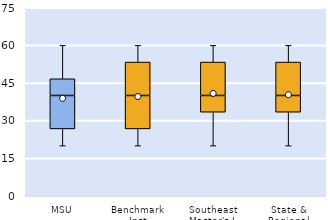
| Category | 25th | 50th | 75th |
|---|---|---|---|
| MSU | 26.667 | 13.333 | 6.667 |
| Benchmark Inst | 26.667 | 13.333 | 13.333 |
| Southeast Master's-L | 33.333 | 6.667 | 13.333 |
| State & Regional | 33.333 | 6.667 | 13.333 |